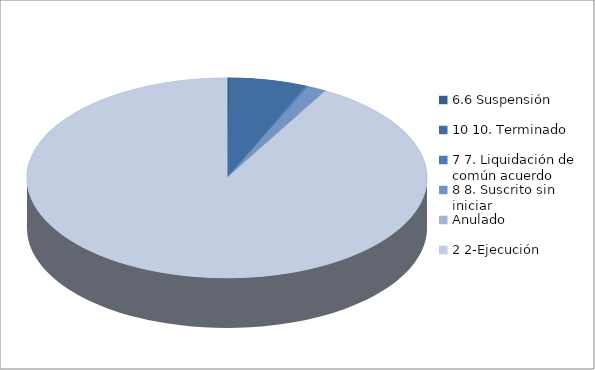
| Category | Series 0 |
|---|---|
| 6.6 Suspensión | 1 |
| 10 10. Terminado | 31 |
| 7 7. Liquidación de común acuerdo | 1 |
| 8 8. Suscrito sin iniciar | 8 |
| Anulado | 0 |
| 2 2-Ejecución | 460 |